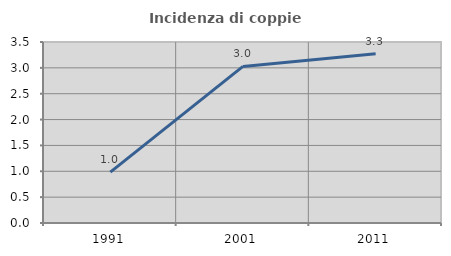
| Category | Incidenza di coppie miste |
|---|---|
| 1991.0 | 0.982 |
| 2001.0 | 3.028 |
| 2011.0 | 3.271 |